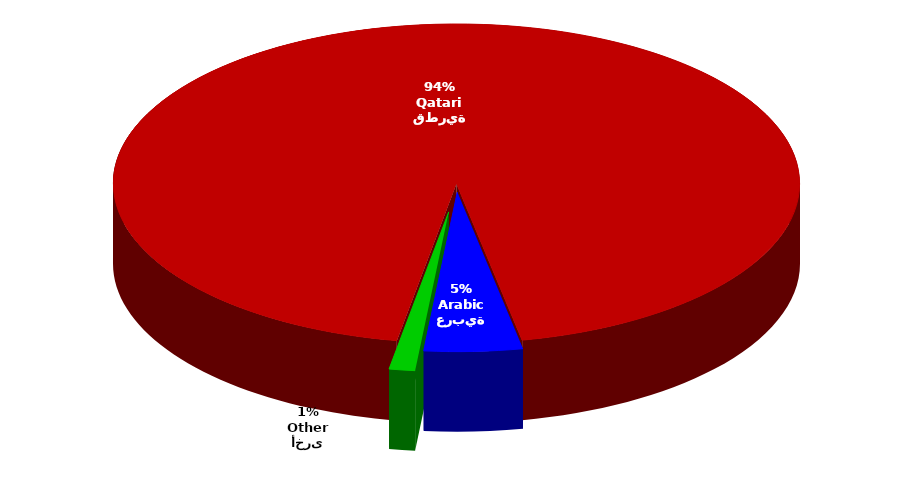
| Category | Series 0 |
|---|---|
| قطرية
Qatari | 4100505 |
| عربية
Arabic | 201235 |
| أخرى
Other | 53033 |